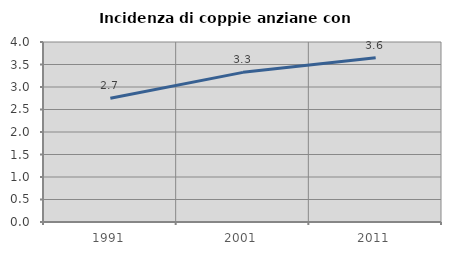
| Category | Incidenza di coppie anziane con figli |
|---|---|
| 1991.0 | 2.749 |
| 2001.0 | 3.325 |
| 2011.0 | 3.648 |